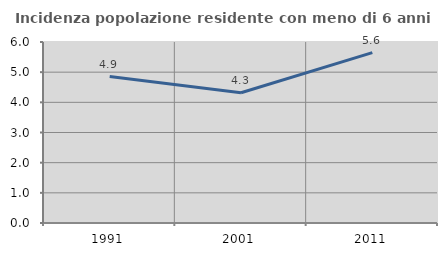
| Category | Incidenza popolazione residente con meno di 6 anni |
|---|---|
| 1991.0 | 4.855 |
| 2001.0 | 4.318 |
| 2011.0 | 5.649 |